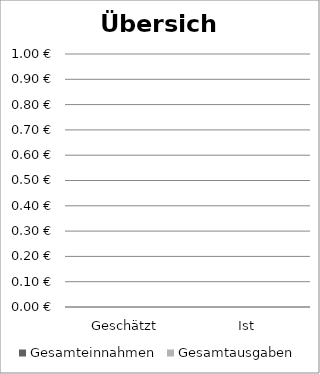
| Category | Gesamteinnahmen | Gesamtausgaben |
|---|---|---|
| Geschätzt | 0 | 0 |
| Ist | 0 | 0 |